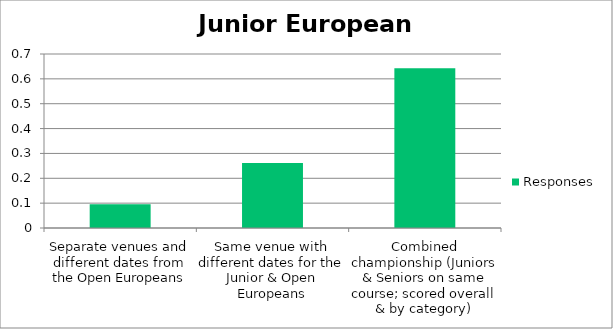
| Category | Responses |
|---|---|
| ;Separate venues and different dates from the Open Europeans | 0.095 |
| ?Same venue with different dates for the Junior & Open Europeans | 0.262 |
| VCombined championship (Juniors & Seniors on same course; scored overall & by category) | 0.643 |